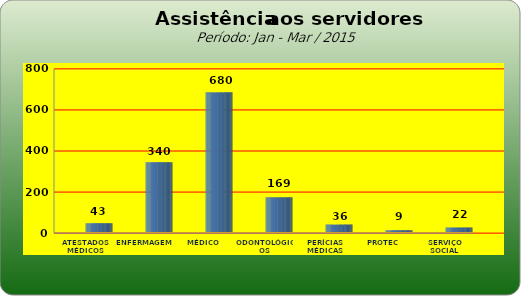
| Category | Series 0 |
|---|---|
| ATESTADOS MÉDICOS | 43 |
| ENFERMAGEM | 340 |
| MÉDICO | 680 |
| ODONTOLÓGICOS | 169 |
| PERÍCIAS MÉDICAS | 36 |
| PROTEC | 9 |
| SERVIÇO SOCIAL | 22 |